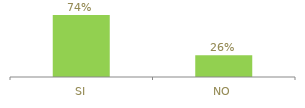
| Category | Series 0 |
|---|---|
| SI | 0.74 |
| NO | 0.26 |